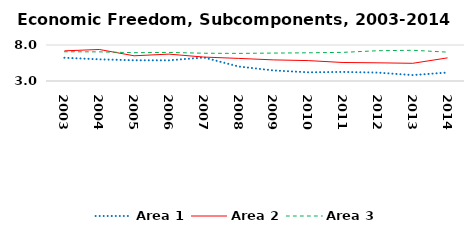
| Category | Area 1 | Area 2 | Area 3 |
|---|---|---|---|
| 2003.0 | 6.231 | 7.188 | 7.059 |
| 2004.0 | 6.009 | 7.379 | 7.047 |
| 2005.0 | 5.883 | 6.501 | 6.932 |
| 2006.0 | 5.868 | 6.733 | 6.97 |
| 2007.0 | 6.265 | 6.325 | 6.858 |
| 2008.0 | 5.014 | 6.14 | 6.836 |
| 2009.0 | 4.466 | 5.934 | 6.878 |
| 2010.0 | 4.205 | 5.833 | 6.916 |
| 2011.0 | 4.261 | 5.569 | 6.978 |
| 2012.0 | 4.165 | 5.525 | 7.207 |
| 2013.0 | 3.823 | 5.457 | 7.267 |
| 2014.0 | 4.178 | 6.212 | 7.007 |